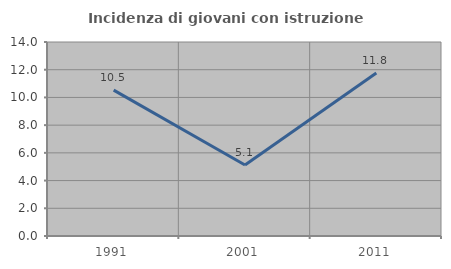
| Category | Incidenza di giovani con istruzione universitaria |
|---|---|
| 1991.0 | 10.526 |
| 2001.0 | 5.128 |
| 2011.0 | 11.765 |